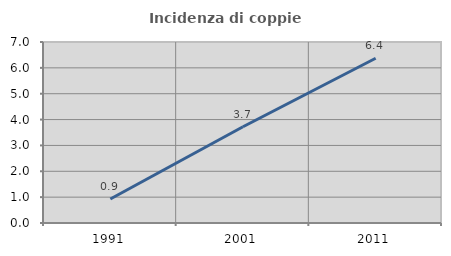
| Category | Incidenza di coppie miste |
|---|---|
| 1991.0 | 0.928 |
| 2001.0 | 3.723 |
| 2011.0 | 6.37 |